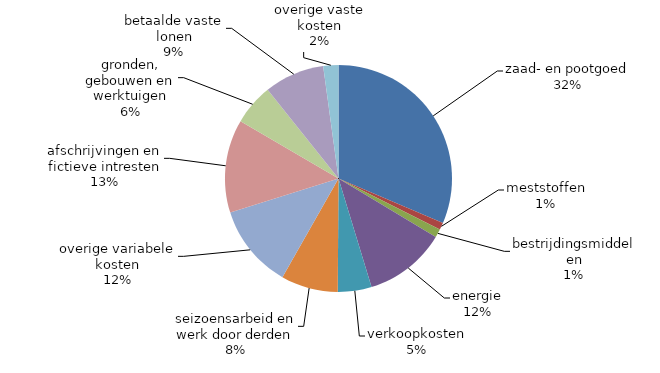
| Category | 2018* |
|---|---|
| zaad- en pootgoed | 241201.066 |
| meststoffen | 7869.004 |
| bestrijdingsmiddelen | 9185.038 |
| energie | 89628.368 |
| verkoopkosten | 36906.579 |
| seizoensarbeid en werk door derden | 62360.397 |
| overige variabele kosten | 91536.551 |
| afschrijvingen en fictieve intresten | 101986.031 |
| gronden, gebouwen en werktuigen | 44873.046 |
| betaalde vaste lonen | 65825.387 |
| overige vaste kosten | 16581.848 |